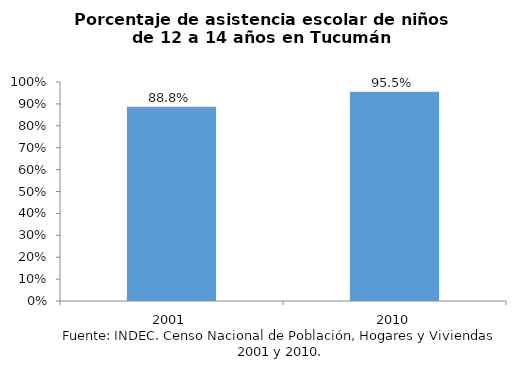
| Category | Series 0 |
|---|---|
| 2001.0 | 0.888 |
| 2010.0 | 0.955 |